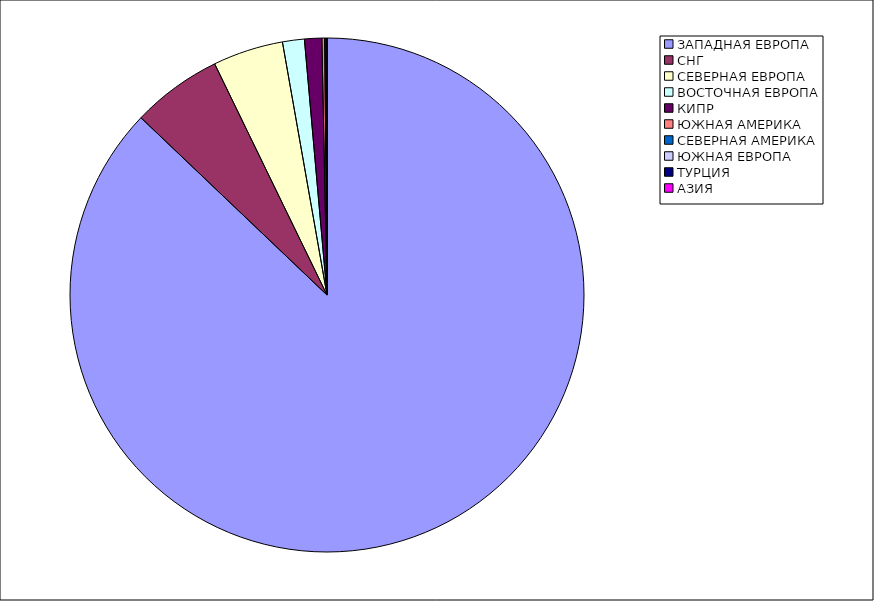
| Category | Оборот |
|---|---|
| ЗАПАДНАЯ ЕВРОПА | 0.871 |
| СНГ | 0.057 |
| СЕВЕРНАЯ ЕВРОПА | 0.044 |
| ВОСТОЧНАЯ ЕВРОПА | 0.014 |
| КИПР | 0.011 |
| ЮЖНАЯ АМЕРИКА | 0.002 |
| СЕВЕРНАЯ АМЕРИКА | 0.001 |
| ЮЖНАЯ ЕВРОПА | 0.001 |
| ТУРЦИЯ | 0 |
| АЗИЯ | 0 |